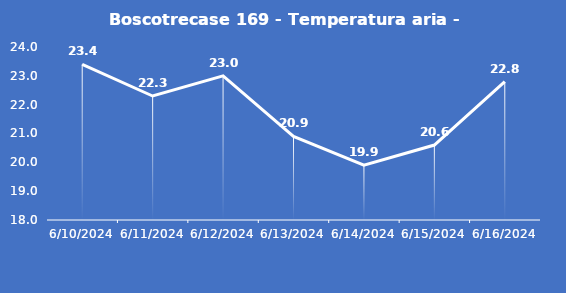
| Category | Boscotrecase 169 - Temperatura aria - Grezzo (°C) |
|---|---|
| 6/10/24 | 23.4 |
| 6/11/24 | 22.3 |
| 6/12/24 | 23 |
| 6/13/24 | 20.9 |
| 6/14/24 | 19.9 |
| 6/15/24 | 20.6 |
| 6/16/24 | 22.8 |